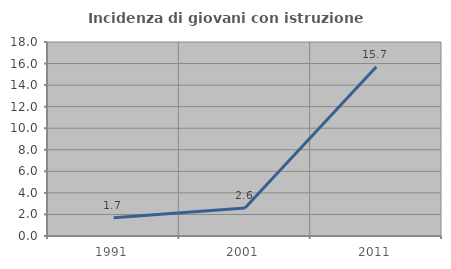
| Category | Incidenza di giovani con istruzione universitaria |
|---|---|
| 1991.0 | 1.685 |
| 2001.0 | 2.604 |
| 2011.0 | 15.702 |